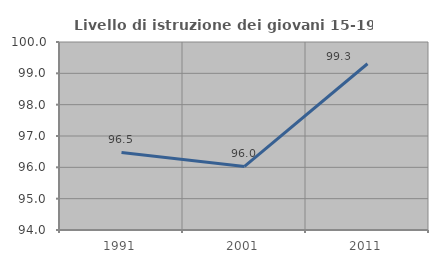
| Category | Livello di istruzione dei giovani 15-19 anni |
|---|---|
| 1991.0 | 96.477 |
| 2001.0 | 96.029 |
| 2011.0 | 99.306 |